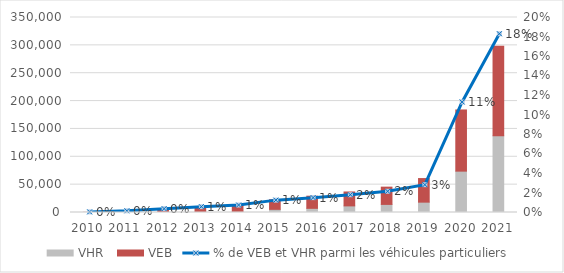
| Category | VHR  | VEB |
|---|---|---|
| 2010.0 | 78 | 187 |
| 2011.0 | 49 | 2630 |
| 2012.0 | 662 | 5662 |
| 2013.0 | 842 | 8781 |
| 2014.0 | 2036 | 10568 |
| 2015.0 | 5677 | 17279 |
| 2016.0 | 7479 | 21771 |
| 2017.0 | 11863 | 24966 |
| 2018.0 | 14530 | 30981 |
| 2019.0 | 18579 | 42325 |
| 2020.0 | 74224 | 109823 |
| 2021.0 | 137828 | 160771 |